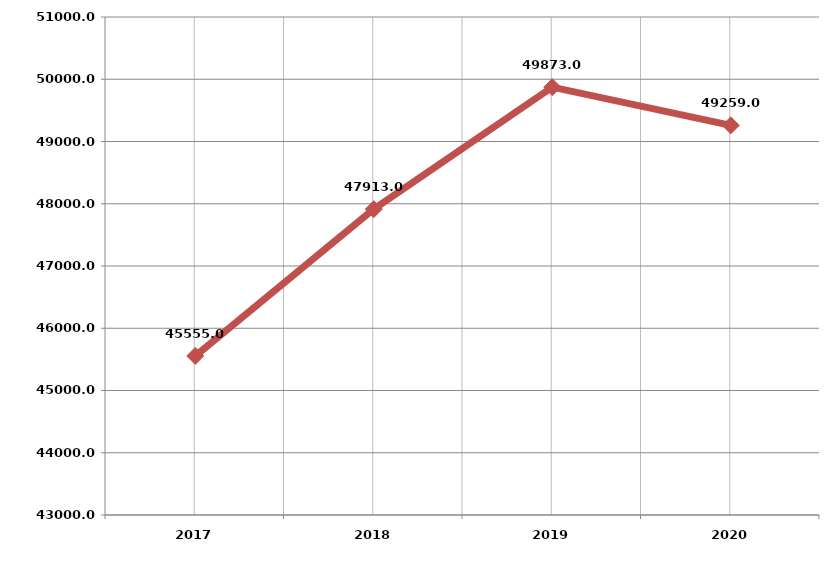
| Category | الطاقة المولــــدة
 [جبجا واط . ساعة) |
|---|---|
| 2017.0 | 45555 |
| 2018.0 | 47913 |
| 2019.0 | 49873 |
| 2020.0 | 49259 |